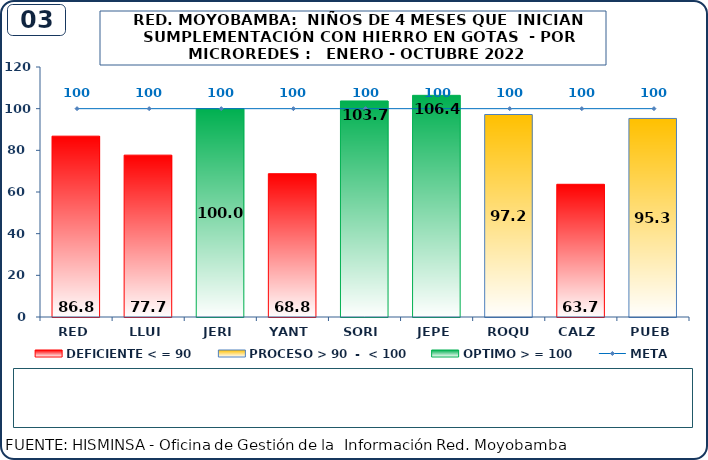
| Category | DEFICIENTE < = 90 | PROCESO > 90  -  < 100 | OPTIMO > = 100 |
|---|---|---|---|
| RED | 86.8 | 0 | 0 |
| LLUI | 77.7 | 0 | 0 |
| JERI | 0 | 0 | 100 |
| YANT | 68.8 | 0 | 0 |
| SORI | 0 | 0 | 103.7 |
| JEPE | 0 | 0 | 106.4 |
| ROQU | 0 | 97.2 | 0 |
| CALZ | 63.7 | 0 | 0 |
| PUEB | 0 | 95.3 | 0 |